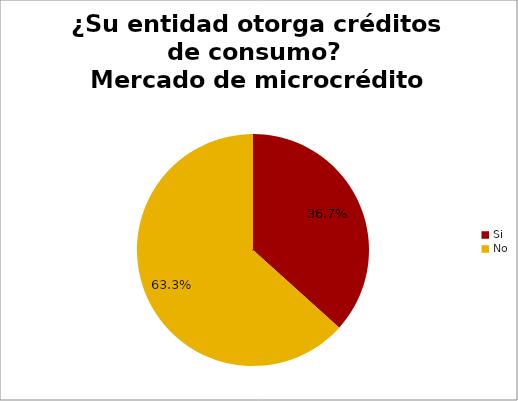
| Category | ¿Su entidad otorga créditos de consumo? Mercado de microcrédito |
|---|---|
| Si | 0.367 |
| No | 0.633 |